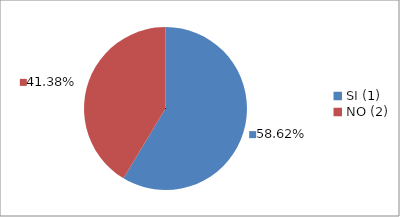
| Category | Series 0 |
|---|---|
| SI (1) | 0.586 |
| NO (2) | 0.414 |